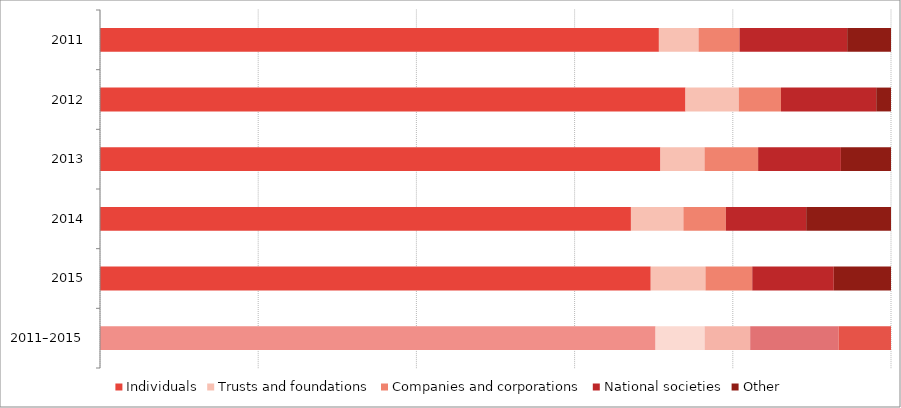
| Category | Individuals | Trusts and foundations | Companies and corporations | National societies | Other |
|---|---|---|---|---|---|
| 2011 | 0.707 | 0.05 | 0.052 | 0.136 | 0.055 |
| 2012 | 0.74 | 0.067 | 0.053 | 0.12 | 0.019 |
| 2013 | 0.709 | 0.056 | 0.068 | 0.105 | 0.063 |
| 2014 | 0.671 | 0.066 | 0.054 | 0.102 | 0.107 |
| 2015 | 0.696 | 0.069 | 0.059 | 0.103 | 0.072 |
| 2011–2015 | 0.702 | 0.062 | 0.058 | 0.112 | 0.066 |